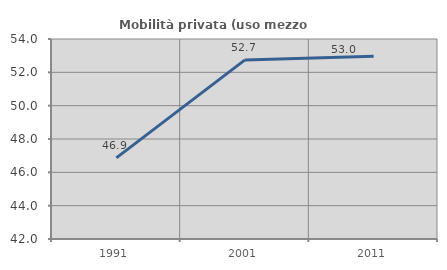
| Category | Mobilità privata (uso mezzo privato) |
|---|---|
| 1991.0 | 46.866 |
| 2001.0 | 52.745 |
| 2011.0 | 52.972 |